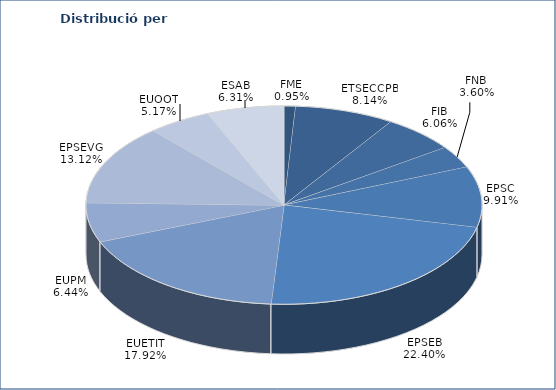
| Category | Series 0 |
|---|---|
| FME | 15 |
| ETSECCPB | 129 |
| FIB | 96 |
| FNB | 57 |
| EPSC | 157 |
| EPSEB | 355 |
| EUETIT | 284 |
| EUPM | 102 |
| EPSEVG | 208 |
| EUOOT | 82 |
| ESAB | 100 |